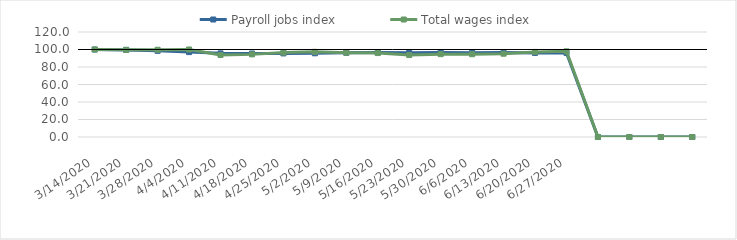
| Category | Payroll jobs index | Total wages index |
|---|---|---|
| 14/03/2020 | 100 | 100 |
| 21/03/2020 | 99.507 | 99.593 |
| 28/03/2020 | 98.496 | 99.674 |
| 04/04/2020 | 97.01 | 99.99 |
| 11/04/2020 | 95.581 | 93.747 |
| 18/04/2020 | 95.438 | 94.429 |
| 25/04/2020 | 95.525 | 96.45 |
| 02/05/2020 | 95.661 | 97.353 |
| 09/05/2020 | 96.186 | 96.362 |
| 16/05/2020 | 96.473 | 95.941 |
| 23/05/2020 | 96.353 | 93.638 |
| 30/05/2020 | 96.497 | 94.682 |
| 06/06/2020 | 96.4 | 94.624 |
| 13/06/2020 | 96.469 | 95.193 |
| 20/06/2020 | 96.078 | 97.22 |
| 27/06/2020 | 96.133 | 97.886 |